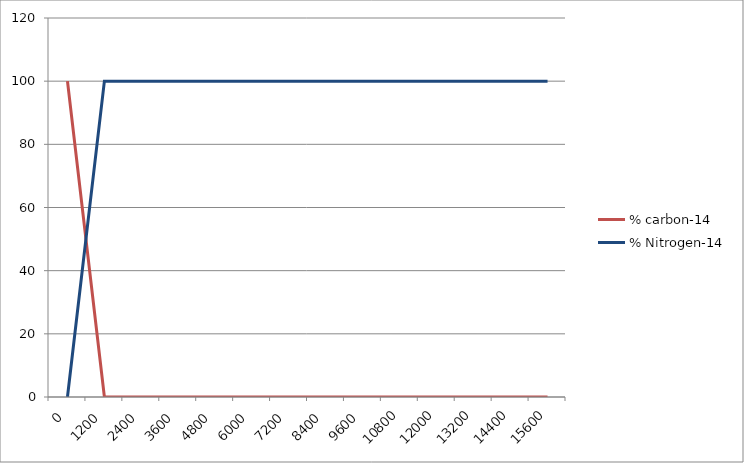
| Category | % carbon-14 | % Nitrogen-14 |
|---|---|---|
| 0.0 | 100 | 0 |
| 1200.0 | 0 | 100 |
| 2400.0 | 0 | 100 |
| 3600.0 | 0 | 100 |
| 4800.0 | 0 | 100 |
| 6000.0 | 0 | 100 |
| 7200.0 | 0 | 100 |
| 8400.0 | 0 | 100 |
| 9600.0 | 0 | 100 |
| 10800.0 | 0 | 100 |
| 12000.0 | 0 | 100 |
| 13200.0 | 0 | 100 |
| 14400.0 | 0 | 100 |
| 15600.0 | 0 | 100 |